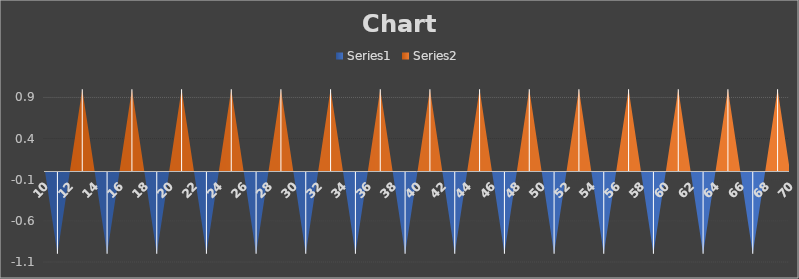
| Category | Series 0 | Series 1 |
|---|---|---|
| 10.0 | 0 | 0 |
| 11.0 | -1 | 0 |
| 12.0 | 0 | 0 |
| 13.0 | 0 | 1 |
| 14.0 | 0 | 0 |
| 15.0 | -1 | 0 |
| 16.0 | 0 | 0 |
| 17.0 | 0 | 1 |
| 18.0 | 0 | 0 |
| 19.0 | -1 | 0 |
| 20.0 | 0 | 0 |
| 21.0 | 0 | 1 |
| 22.0 | 0 | 0 |
| 23.0 | -1 | 0 |
| 24.0 | 0 | 0 |
| 25.0 | 0 | 1 |
| 26.0 | 0 | 0 |
| 27.0 | -1 | 0 |
| 28.0 | 0 | 0 |
| 29.0 | 0 | 1 |
| 30.0 | 0 | 0 |
| 31.0 | -1 | 0 |
| 32.0 | 0 | 0 |
| 33.0 | 0 | 1 |
| 34.0 | 0 | 0 |
| 35.0 | -1 | 0 |
| 36.0 | 0 | 0 |
| 37.0 | 0 | 1 |
| 38.0 | 0 | 0 |
| 39.0 | -1 | 0 |
| 40.0 | 0 | 0 |
| 41.0 | 0 | 1 |
| 42.0 | 0 | 0 |
| 43.0 | -1 | 0 |
| 44.0 | 0 | 0 |
| 45.0 | 0 | 1 |
| 46.0 | 0 | 0 |
| 47.0 | -1 | 0 |
| 48.0 | 0 | 0 |
| 49.0 | 0 | 1 |
| 50.0 | 0 | 0 |
| 51.0 | -1 | 0 |
| 52.0 | 0 | 0 |
| 53.0 | 0 | 1 |
| 54.0 | 0 | 0 |
| 55.0 | -1 | 0 |
| 56.0 | 0 | 0 |
| 57.0 | 0 | 1 |
| 58.0 | 0 | 0 |
| 59.0 | -1 | 0 |
| 60.0 | 0 | 0 |
| 61.0 | 0 | 1 |
| 62.0 | 0 | 0 |
| 63.0 | -1 | 0 |
| 64.0 | 0 | 0 |
| 65.0 | 0 | 1 |
| 66.0 | 0 | 0 |
| 67.0 | -1 | 0 |
| 68.0 | 0 | 0 |
| 69.0 | 0 | 1 |
| 70.0 | 0 | 0 |